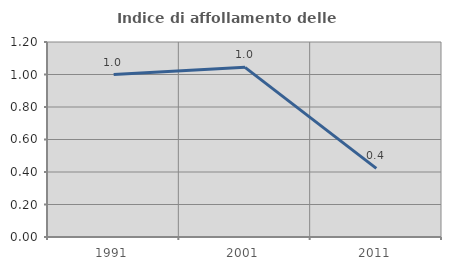
| Category | Indice di affollamento delle abitazioni  |
|---|---|
| 1991.0 | 1 |
| 2001.0 | 1.044 |
| 2011.0 | 0.422 |